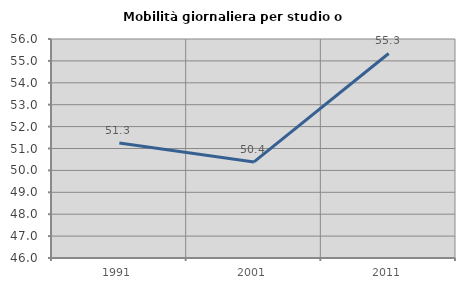
| Category | Mobilità giornaliera per studio o lavoro |
|---|---|
| 1991.0 | 51.251 |
| 2001.0 | 50.388 |
| 2011.0 | 55.34 |